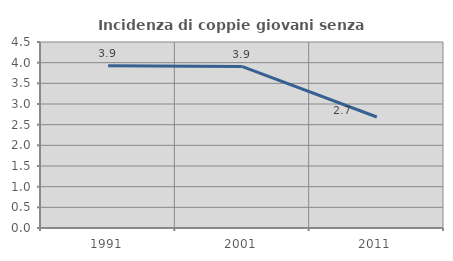
| Category | Incidenza di coppie giovani senza figli |
|---|---|
| 1991.0 | 3.927 |
| 2001.0 | 3.906 |
| 2011.0 | 2.685 |